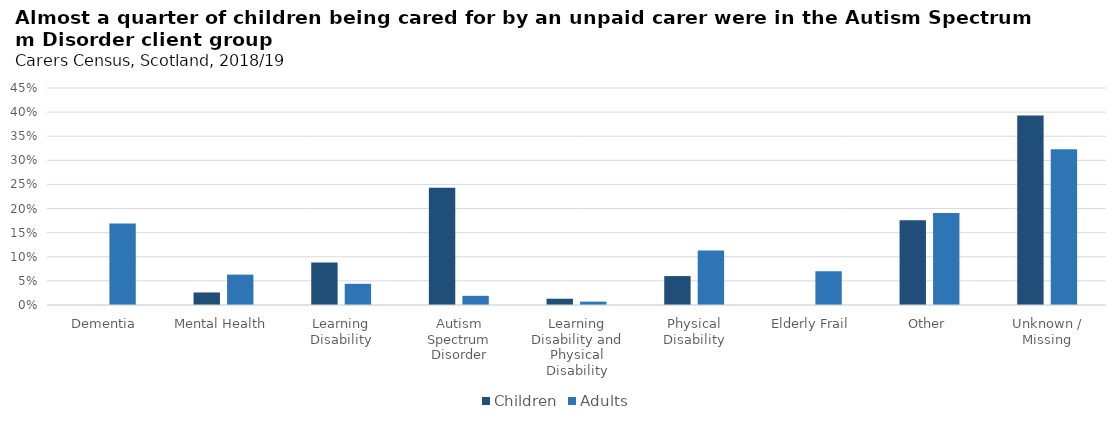
| Category | Children | Adults |
|---|---|---|
| Dementia | 0 | 0.169 |
| Mental Health | 0.026 | 0.063 |
| Learning Disability | 0.088 | 0.044 |
| Autism Spectrum Disorder | 0.243 | 0.019 |
| Learning Disability and Physical Disability | 0.013 | 0.007 |
| Physical Disability | 0.06 | 0.113 |
| Elderly Frail | 0 | 0.07 |
| Other | 0.176 | 0.191 |
| Unknown / Missing | 0.393 | 0.323 |